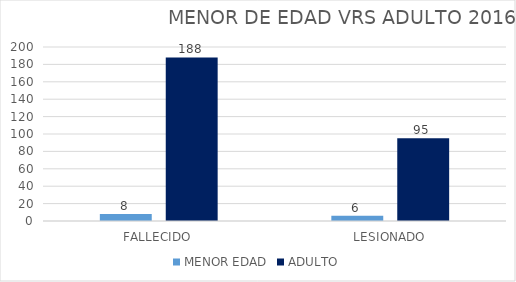
| Category | MENOR EDAD | ADULTO |
|---|---|---|
| FALLECIDO | 8 | 188 |
| LESIONADO | 6 | 95 |